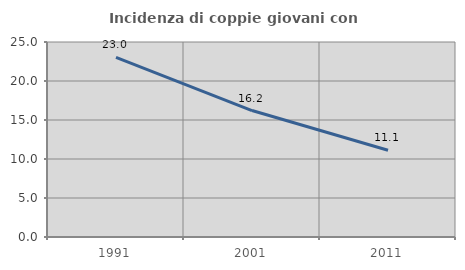
| Category | Incidenza di coppie giovani con figli |
|---|---|
| 1991.0 | 23.028 |
| 2001.0 | 16.214 |
| 2011.0 | 11.114 |